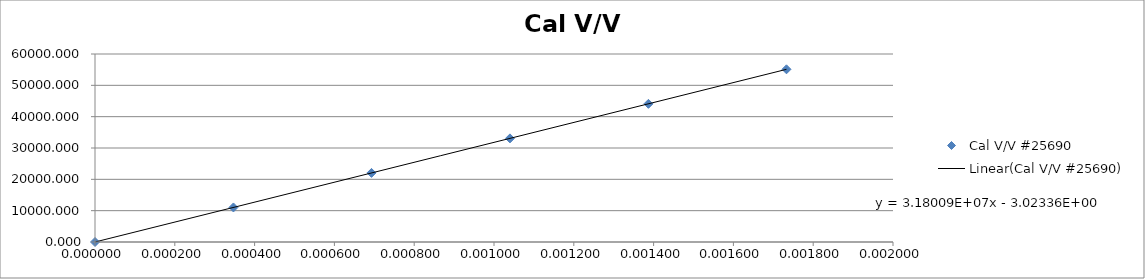
| Category | Cal V/V #25690 |
|---|---|
| 0.0 | 0 |
| 0.000347 | 11023.113 |
| 0.000693 | 22046.226 |
| 0.00104 | 33069.339 |
| 0.001387 | 44092.452 |
| 0.001733 | 55115.566 |